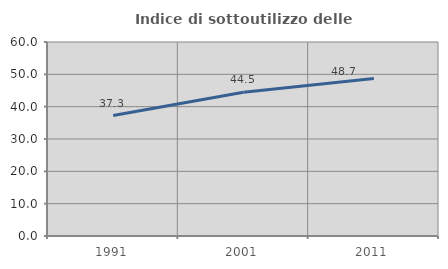
| Category | Indice di sottoutilizzo delle abitazioni  |
|---|---|
| 1991.0 | 37.265 |
| 2001.0 | 44.461 |
| 2011.0 | 48.68 |